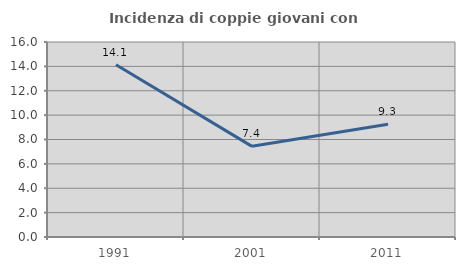
| Category | Incidenza di coppie giovani con figli |
|---|---|
| 1991.0 | 14.13 |
| 2001.0 | 7.438 |
| 2011.0 | 9.259 |